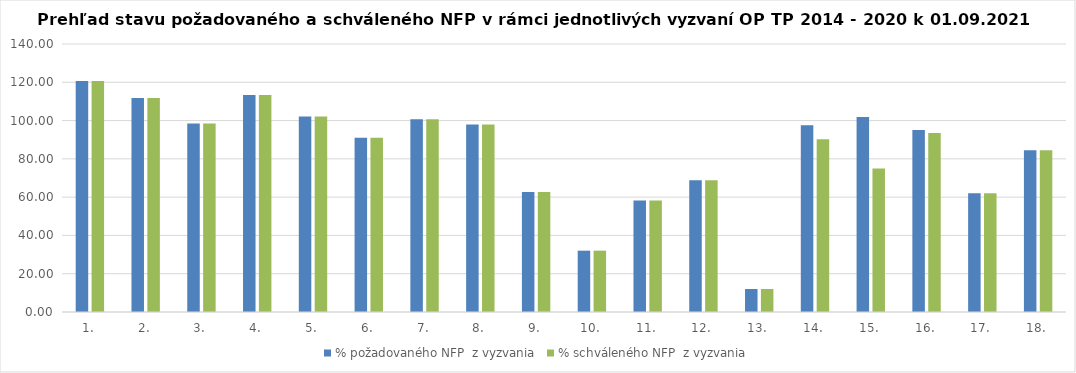
| Category | % požadovaného NFP  z vyzvania | % schváleného NFP  z vyzvania |
|---|---|---|
| 1. | 120.662 | 120.662 |
| 2. | 111.83 | 111.83 |
| 3. | 98.465 | 98.465 |
| 4. | 113.295 | 113.295 |
| 5. | 102.19 | 102.19 |
| 6. | 91.016 | 91.016 |
| 7. | 100.637 | 100.637 |
| 8. | 97.989 | 97.989 |
| 9. | 62.721 | 62.721 |
| 10. | 32.038 | 32.038 |
| 11. | 58.283 | 58.283 |
| 12. | 68.88 | 68.88 |
| 13. | 12.008 | 12.008 |
| 14. | 97.549 | 90.292 |
| 15. | 101.921 | 74.972 |
| 16. | 95.126 | 93.51 |
| 17. | 61.969 | 61.969 |
| 18. | 84.514 | 84.514 |